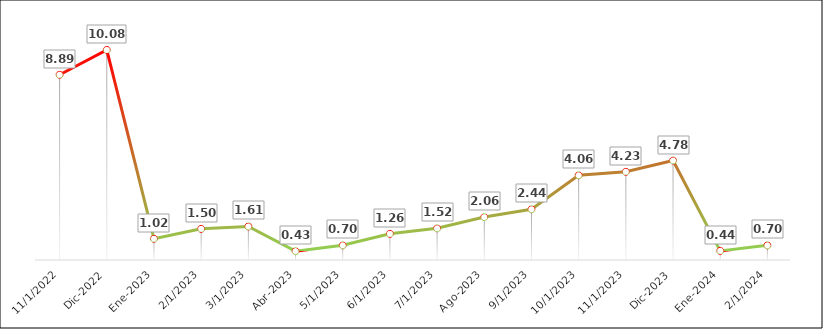
| Category | Inflación acumulada anual |
|---|---|
| Nov-2022 | 8.891 |
| Dic-2022 | 10.083 |
| Ene-2023 | 1.023 |
| Feb-2023 | 1.495 |
| Mar-2023 | 1.61 |
| Abr-2023 | 0.426 |
| May-2023 | 0.705 |
| Jun-2023 | 1.256 |
| Jul-2023 | 1.521 |
| Ago-2023 | 2.06 |
| Sep-2023 | 2.436 |
| Oct-2023 | 4.064 |
| Nov-2023 | 4.235 |
| Dic-2023 | 4.776 |
| Ene-2024 | 0.438 |
| Feb-2024 | 0.703 |